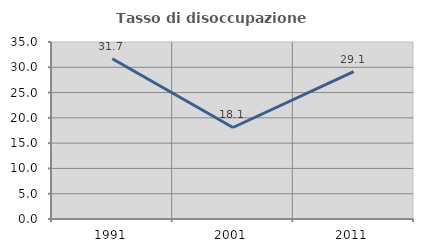
| Category | Tasso di disoccupazione giovanile  |
|---|---|
| 1991.0 | 31.687 |
| 2001.0 | 18.095 |
| 2011.0 | 29.126 |